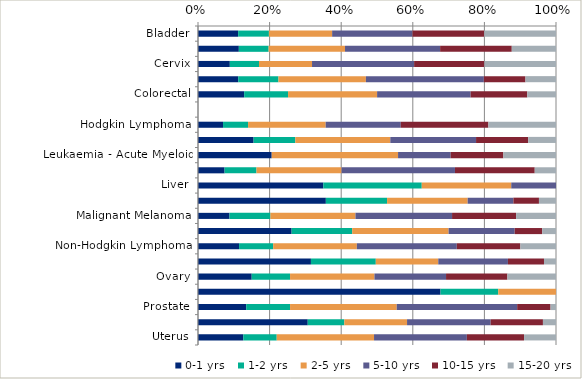
| Category | 0-1 yrs | 1-2 yrs | 2-5 yrs | 5-10 yrs | 10-15 yrs | 15-20 yrs |
|---|---|---|---|---|---|---|
| Bladder | 0.112 | 0.086 | 0.177 | 0.224 | 0.2 | 0.2 |
| Breast | 0.114 | 0.083 | 0.213 | 0.266 | 0.2 | 0.124 |
| Cervix | 0.089 | 0.081 | 0.148 | 0.285 | 0.196 | 0.2 |
| Central Nervous System (including Brain) | 0.112 | 0.112 | 0.244 | 0.329 | 0.116 | 0.085 |
| Colorectal | 0.129 | 0.123 | 0.249 | 0.261 | 0.158 | 0.08 |
| Head and Neck | 0 | 0 | 0 | 0 | 0 | 0 |
| Hodgkin Lymphoma | 0.07 | 0.07 | 0.217 | 0.21 | 0.245 | 0.189 |
| Kidney and unspecified urinary organs | 0.155 | 0.117 | 0.265 | 0.239 | 0.146 | 0.078 |
| Leukaemia - Acute Myeloid | 0.206 | 0 | 0.353 | 0.147 | 0.147 | 0.147 |
| Leukaemia - Chronic Lymphocytic | 0.074 | 0.089 | 0.238 | 0.317 | 0.223 | 0.059 |
| Liver | 0.35 | 0.275 | 0.25 | 0.125 | 0 | 0 |
| Lung | 0.357 | 0.171 | 0.225 | 0.128 | 0.071 | 0.048 |
| Malignant Melanoma | 0.088 | 0.114 | 0.238 | 0.27 | 0.179 | 0.111 |
| Multiple Myeloma | 0.262 | 0.169 | 0.269 | 0.185 | 0.077 | 0.038 |
| Non-Hodgkin Lymphoma | 0.115 | 0.095 | 0.234 | 0.279 | 0.177 | 0.1 |
| Oesophagus | 0.315 | 0.181 | 0.174 | 0.195 | 0.101 | 0.034 |
| Ovary | 0.15 | 0.107 | 0.236 | 0.2 | 0.171 | 0.136 |
| Pancreas | 0.677 | 0.161 | 0.161 | 0 | 0 | 0 |
| Prostate | 0.135 | 0.122 | 0.298 | 0.336 | 0.093 | 0.015 |
| Stomach | 0.307 | 0.102 | 0.175 | 0.234 | 0.146 | 0.036 |
| Uterus | 0.127 | 0.093 | 0.272 | 0.259 | 0.16 | 0.089 |